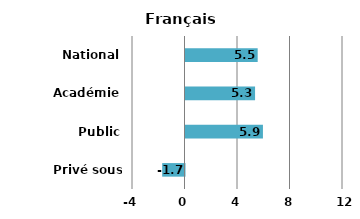
| Category | Ecart |
|---|---|
| Privé sous contrat | -1.7 |
| Public | 5.9 |
| Académie | 5.3 |
| National | 5.5 |